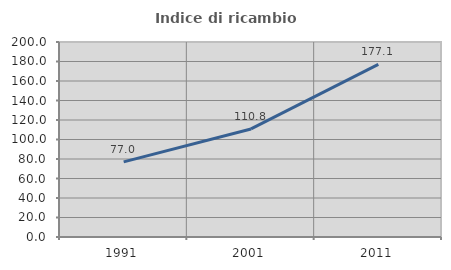
| Category | Indice di ricambio occupazionale  |
|---|---|
| 1991.0 | 77.037 |
| 2001.0 | 110.833 |
| 2011.0 | 177.083 |